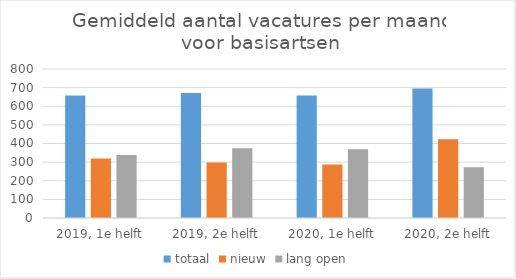
| Category | totaal | nieuw | lang open |
|---|---|---|---|
| 2019, 1e helft | 657.167 | 319.5 | 337.667 |
| 2019, 2e helft | 671.667 | 297.667 | 374 |
| 2020, 1e helft | 657.333 | 287.667 | 369.667 |
| 2020, 2e helft | 695.833 | 422.833 | 273 |